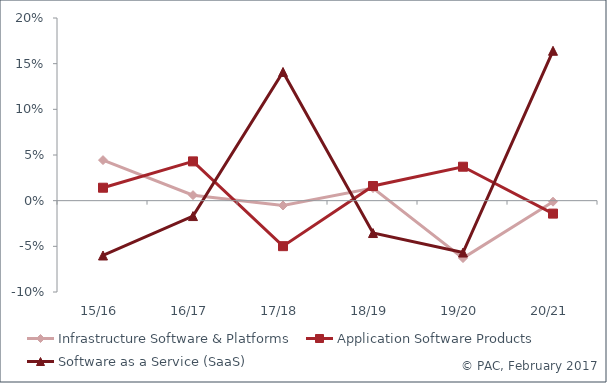
| Category | Infrastructure Software & Platforms | Application Software Products | Software as a Service (SaaS) |
|---|---|---|---|
| 15/16 | 0.044 | 0.014 | -0.06 |
| 16/17 | 0.006 | 0.043 | -0.017 |
| 17/18 | -0.005 | -0.05 | 0.141 |
| 18/19 | 0.014 | 0.016 | -0.035 |
| 19/20 | -0.063 | 0.037 | -0.057 |
| 20/21 | -0.001 | -0.014 | 0.164 |